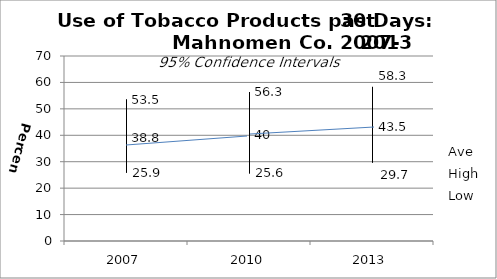
| Category | Ave | High | Low |
|---|---|---|---|
| 2007.0 | 38.8 | 53.5 | 25.9 |
| 2010.0 | 40 | 56.3 | 25.6 |
| 2013.0 | 43.5 | 58.3 | 29.7 |